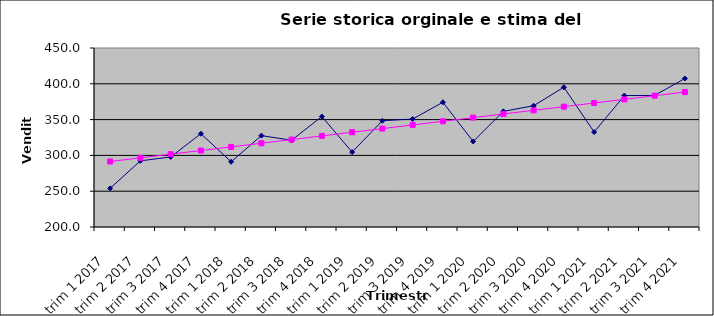
| Category | y | Series 1 |
|---|---|---|
| trim 1 2017 | 254 | 291.471 |
| trim 2 2017 | 292.4 | 296.577 |
| trim 3 2017 | 297.8 | 301.683 |
| trim 4 2017 | 330.3 | 306.789 |
| trim 1 2018 | 291.1 | 311.896 |
| trim 2 2018 | 327.6 | 317.002 |
| trim 3 2018 | 321.2 | 322.108 |
| trim 4 2018 | 354.3 | 327.214 |
| trim 1 2019 | 304.6 | 332.321 |
| trim 2 2019 | 348.4 | 337.427 |
| trim 3 2019 | 350.8 | 342.533 |
| trim 4 2019 | 374.2 | 347.639 |
| trim 1 2020 | 319.5 | 352.746 |
| trim 2 2020 | 361.5 | 357.852 |
| trim 3 2020 | 369.4 | 362.958 |
| trim 4 2020 | 395.2 | 368.064 |
| trim 1 2021 | 332.6 | 373.171 |
| trim 2 2021 | 383.5 | 378.277 |
| trim 3 2021 | 383.8 | 383.383 |
| trim 4 2021 | 407.4 | 388.489 |